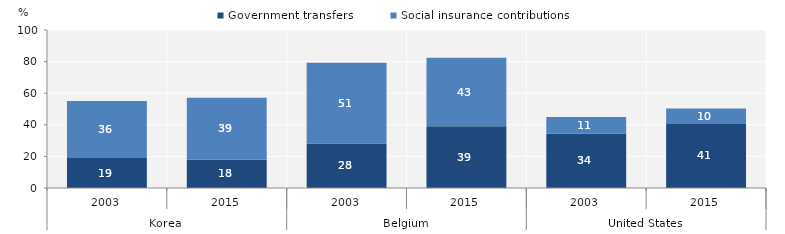
| Category | Government transfers | Social insurance contributions |
|---|---|---|
| 0 | 18.921 | 36.202 |
| 1 | 17.801 | 39.324 |
| 2 | 28.208 | 51.103 |
| 3 | 39.043 | 43.362 |
| 4 | 34.32 | 10.575 |
| 5 | 40.555 | 9.801 |